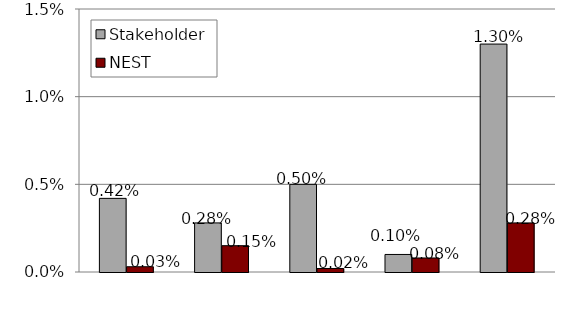
| Category | Stakeholder | NEST |
|---|---|---|
| Up-front | 0.004 | 0 |
| Ongoing | 0.003 | 0.002 |
| Turnover | 0.005 | 0 |
| Fund management | 0.001 | 0.001 |
| Total | 0.013 | 0.003 |